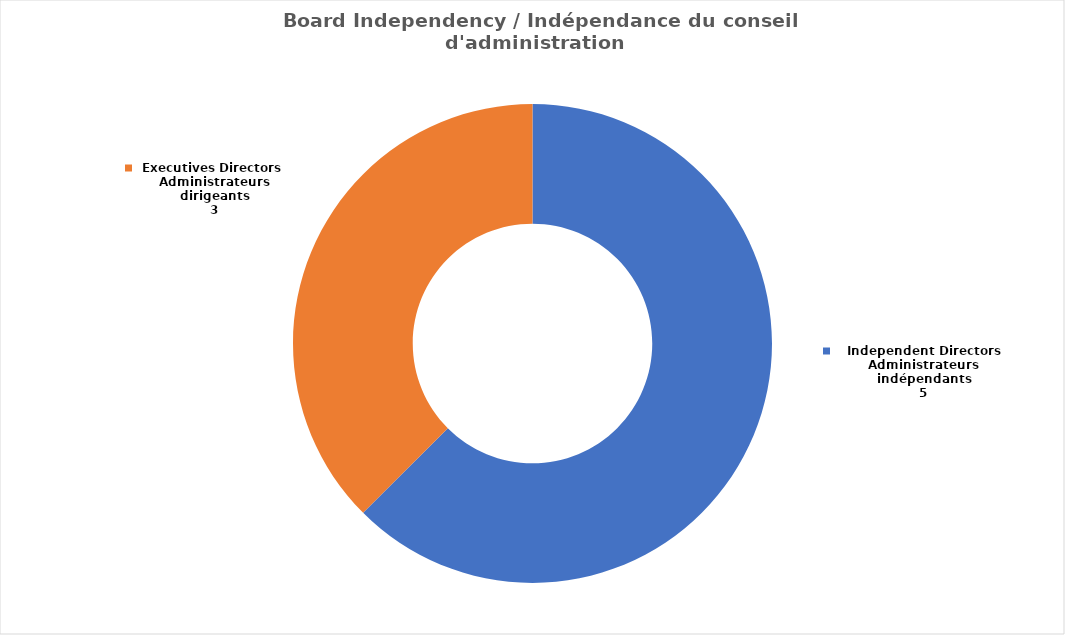
| Category | Series 0 |
|---|---|
| Independent Directors Administrateurs indépendants | 5 |
| Executives Directors 
Administrateurs dirigeants | 3 |